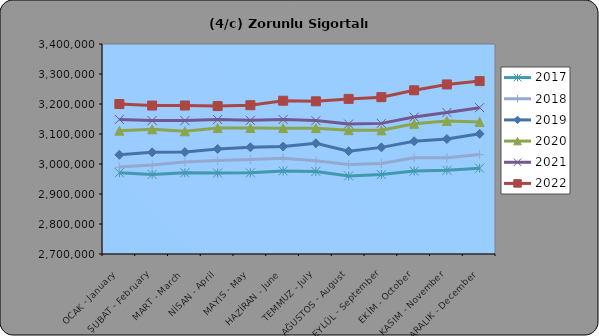
| Category | 2017 | 2018 | 2019 | 2020 | 2021 | 2022 |
|---|---|---|---|---|---|---|
| OCAK - January | 2971096 | 2989631 | 3030725 | 3110922 | 3148682 | 3199924 |
| ŞUBAT - February | 2965218 | 2996690 | 3038819 | 3115640 | 3144723 | 3194863 |
| MART - March | 2970810 | 3006828 | 3039681 | 3108959 | 3144608 | 3194993 |
| NİSAN - April | 2969930 | 3011373 | 3050182 | 3119852 | 3148326 | 3193072 |
| MAYIS - May | 2970555 | 3014740 | 3055833 | 3119932 | 3145479 | 3195954 |
| HAZİRAN - June | 2976758 | 3019444 | 3058258 | 3119541 | 3148469 | 3210921 |
| TEMMUZ - July | 2975092 | 3010588 | 3069057 | 3119297 | 3144628 | 3208911 |
| AĞUSTOS - August | 2960311 | 2998531 | 3042624 | 3112875 | 3133244 | 3217034 |
| EYLÜL - September | 2964754 | 3001713 | 3055436 | 3112213 | 3135413 | 3222831 |
| EKİM - October | 2976497 | 3020919 | 3075826 | 3133911 | 3156402 | 3245683 |
| KASIM - November | 2979048 | 3021127 | 3083315 | 3143475 | 3171761 | 3265200 |
| ARALIK - December | 2986088 | 3031311 | 3100511 | 3140410 | 3187862 | 3276416 |